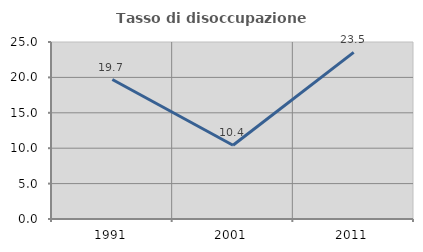
| Category | Tasso di disoccupazione giovanile  |
|---|---|
| 1991.0 | 19.697 |
| 2001.0 | 10.417 |
| 2011.0 | 23.529 |